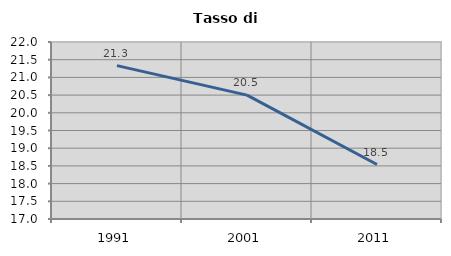
| Category | Tasso di disoccupazione   |
|---|---|
| 1991.0 | 21.333 |
| 2001.0 | 20.5 |
| 2011.0 | 18.539 |